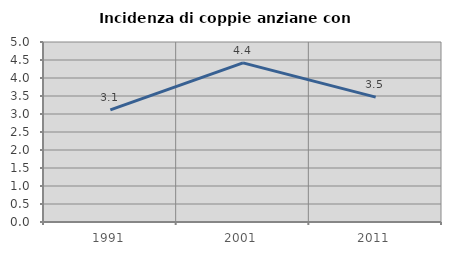
| Category | Incidenza di coppie anziane con figli |
|---|---|
| 1991.0 | 3.115 |
| 2001.0 | 4.419 |
| 2011.0 | 3.47 |